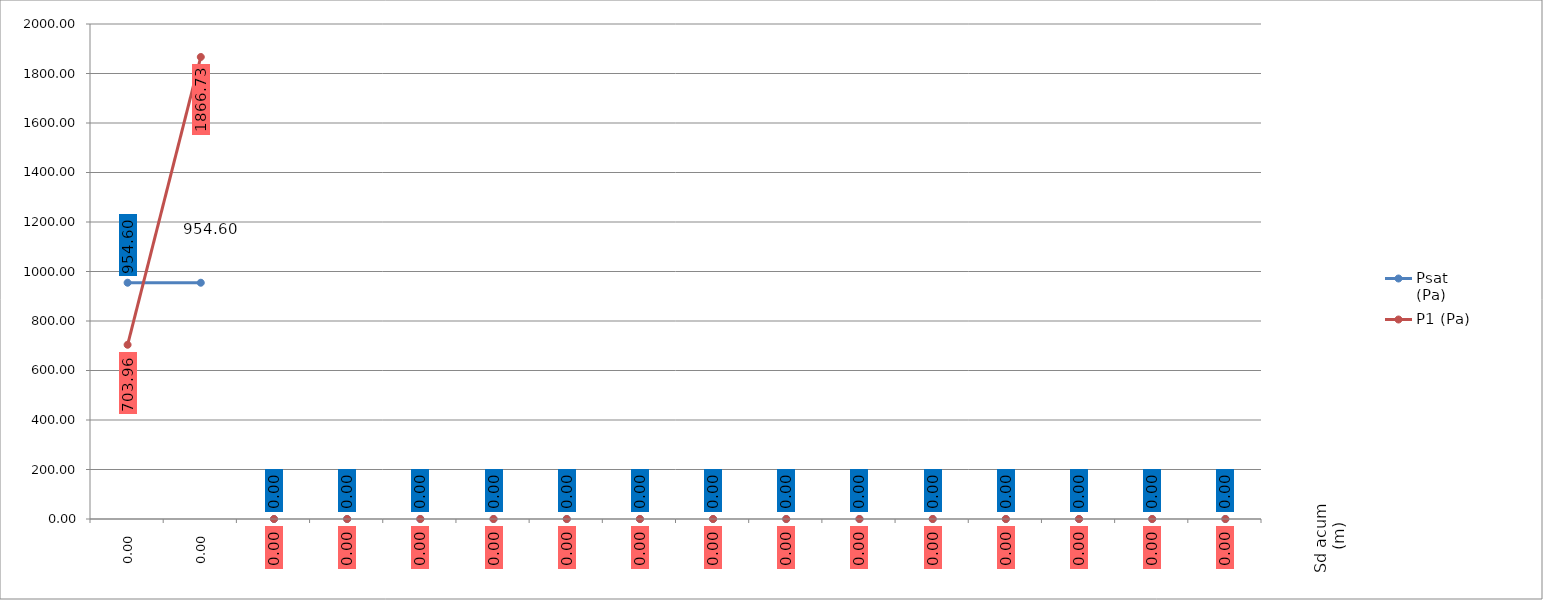
| Category | Psat (Pa) | P1 (Pa) |
|---|---|---|
| 0,00 | 954.604 | 703.963 |
| 0,00 | 954.604 | 1866.729 |